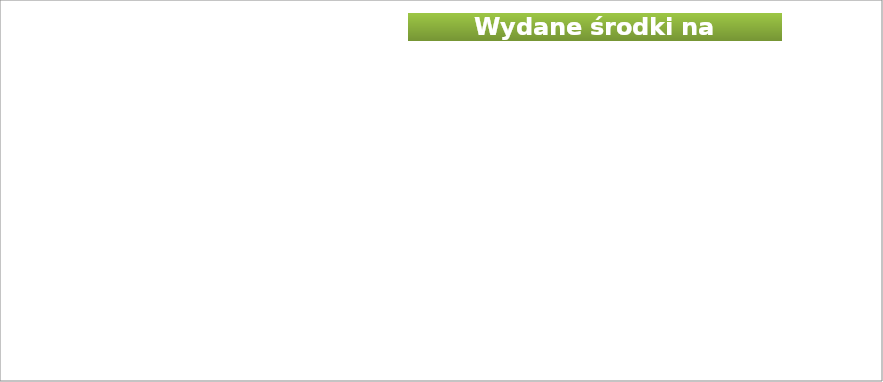
| Category | Kwota wydanych środków na aktywizację |
|---|---|
| 2018 | 13206864.77 |
| 2019 | 13127068.03 |
| 2020 | 11269754.78 |
| 2021 | 19592265.48 |
| 01.2022 | 4513299.15 |